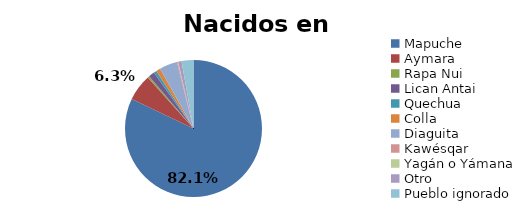
| Category | Nacidos en Chile |
|---|---|
| Mapuche | 0.821 |
| Aymara | 0.063 |
| Rapa Nui | 0.004 |
| Lican Antai | 0.014 |
| Quechua | 0.007 |
| Colla | 0.01 |
| Diaguita | 0.042 |
| Kawésqar | 0.002 |
| Yagán o Yámana | 0.001 |
| Otro | 0.008 |
| Pueblo ignorado | 0.028 |